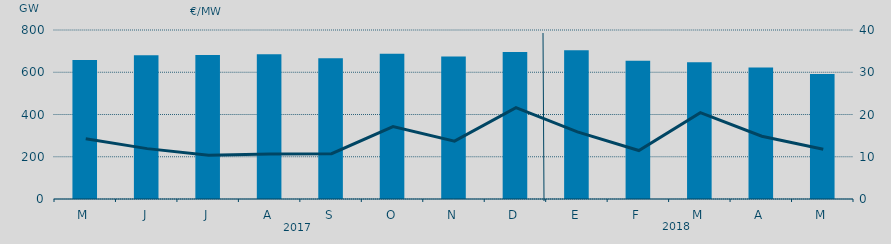
| Category | Energia (MWh) a subir |
|---|---|
| M | 657.634 |
| J | 680.754 |
| J | 681.722 |
| A | 685.083 |
| S | 666.501 |
| O | 686.996 |
| N | 674.335 |
| D | 695.754 |
| E | 703.828 |
| F | 654.951 |
| M | 647.688 |
| A | 622.901 |
| M | 591.481 |